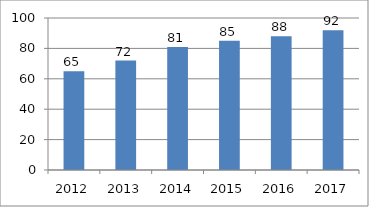
| Category | Series 0 |
|---|---|
| 2012.0 | 65 |
| 2013.0 | 72 |
| 2014.0 | 81 |
| 2015.0 | 85 |
| 2016.0 | 88 |
| 2017.0 | 92 |